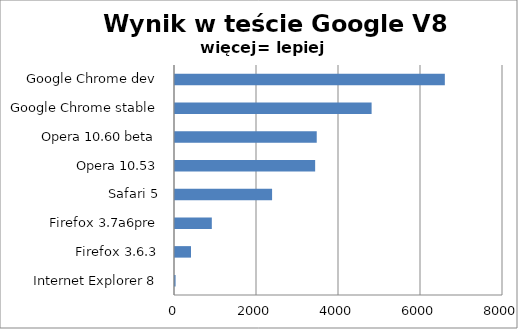
| Category | Series 0 |
|---|---|
| Internet Explorer 8 | 14.097 |
| Firefox 3.6.3 | 389.667 |
| Firefox 3.7a6pre | 898 |
| Safari 5 | 2368 |
| Opera 10.53 | 3418.333 |
| Opera 10.60 beta | 3457 |
| Google Chrome stable | 4795.333 |
| Google Chrome dev | 6581.333 |